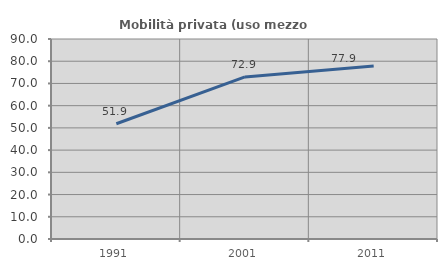
| Category | Mobilità privata (uso mezzo privato) |
|---|---|
| 1991.0 | 51.852 |
| 2001.0 | 72.941 |
| 2011.0 | 77.899 |